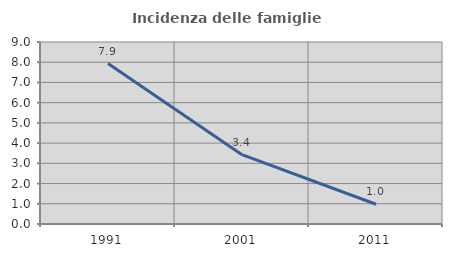
| Category | Incidenza delle famiglie numerose |
|---|---|
| 1991.0 | 7.932 |
| 2001.0 | 3.43 |
| 2011.0 | 0.978 |